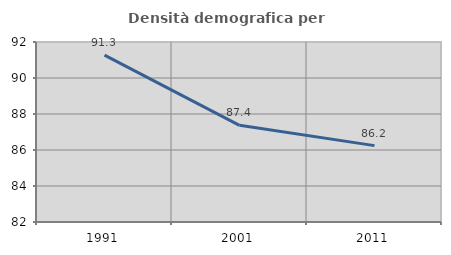
| Category | Densità demografica |
|---|---|
| 1991.0 | 91.27 |
| 2001.0 | 87.37 |
| 2011.0 | 86.243 |